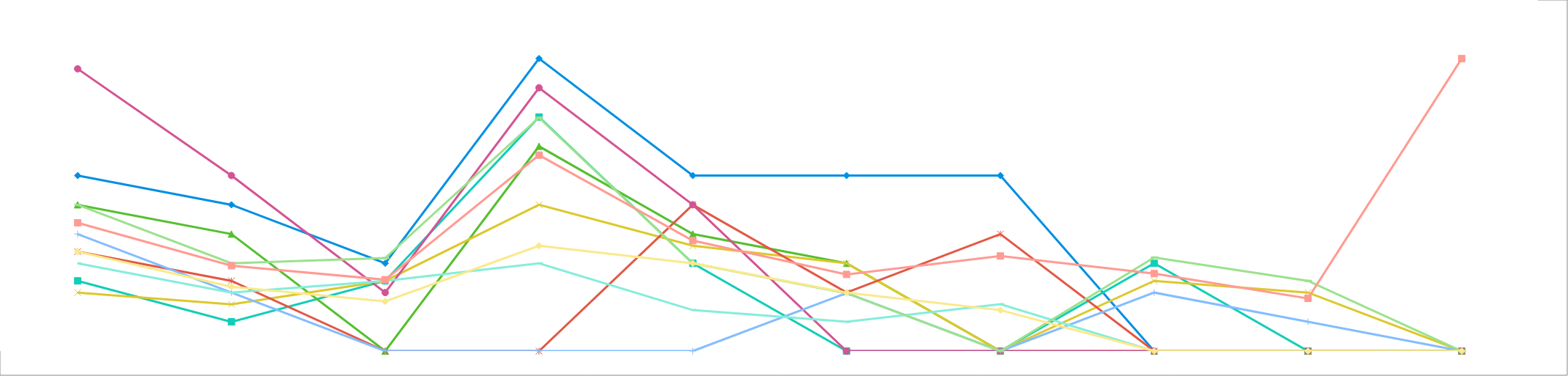
| Category | медиаселлер | Лаба24 онлайн | Регион медиа | Фонарь  | Диджитал эксперт | Диджитал инфо | Частный Маркетолог | B@B creative | Copypasta | Синергия  | Средняя стоимость |
|---|---|---|---|---|---|---|---|---|---|---|---|
| Контекстная реклама Яндекс (настройка) | 30000 | 12000 | 25000 | 10000 | 17000 | 48240 | 20000 | 15000 | 25000 | 17000 | 21924 |
| Контекстная реклама Гугл (настройка) | 25000 | 5000 | 20000 | 8000 | 12000 | 30000 | 10000 | 10000 | 15000 | 11000 | 14600 |
| Сквозная аналитика | 15000 | 12000 | 0 | 12000 | 0 | 10000 | 0 | 12000 | 15900 | 8500 | 12200 |
| Создание сайта | 50000 | 40000 | 35000 | 25000 | 0 | 45000 | 0 | 15000 | 39900 | 18000 | 33487.5 |
| Таргетировная реклама | 30000 | 15000 | 20000 | 18000 | 25000 | 25000 | 0 | 7000 | 14990 | 15000 | 18887.778 |
| Ежемесячное Ведение рекламы | 30000 | 0 | 15000 | 15000 | 10000 | 0 | 9900 | 5000 | 9900 | 10000 | 13100 |
| Подключение битрикс | 30000 | 0 | 0 | 0 | 20000 | 0 | 0 | 8000 | 0 | 7000 | 16250 |
| Авито магазин | 0 | 15000 | 0 | 12000 | 0 | 0 | 10000 | 0 | 16000 | 0 | 13250 |
| Юла магазин | 0 | 0 | 0 | 10000 | 0 | 0 | 5000 | 0 | 12000 | 0 | 9000 |
| Интеллектуальные Роботы помощники | 0 | 0 | 0 | 0 | 0 | 0 | 0 | 0 | 0 | 0 | 50000 |